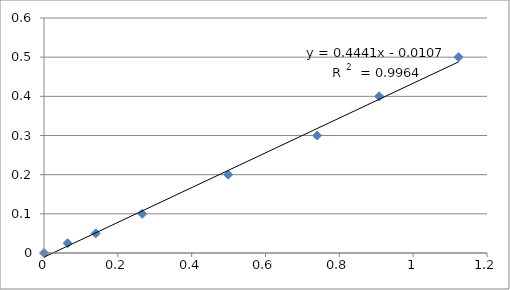
| Category | Series 0 |
|---|---|
| 0.0 | 0 |
| 0.064 | 0.025 |
| 0.14 | 0.05 |
| 0.266 | 0.1 |
| 0.499 | 0.2 |
| 0.74 | 0.3 |
| 0.908 | 0.4 |
| 1.123 | 0.5 |